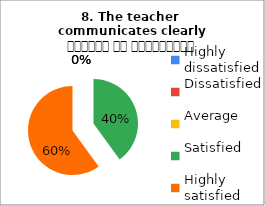
| Category | 8. The teacher 
communicates clearly शिक्षक का सम्प्रेषण सुस्पष्ट है |
|---|---|
| Highly dissatisfied | 0 |
| Dissatisfied | 0 |
| Average | 0 |
| Satisfied | 6 |
| Highly satisfied | 9 |